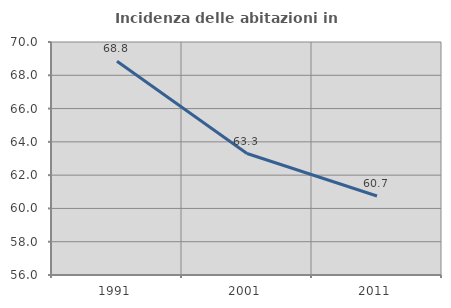
| Category | Incidenza delle abitazioni in proprietà  |
|---|---|
| 1991.0 | 68.846 |
| 2001.0 | 63.298 |
| 2011.0 | 60.749 |